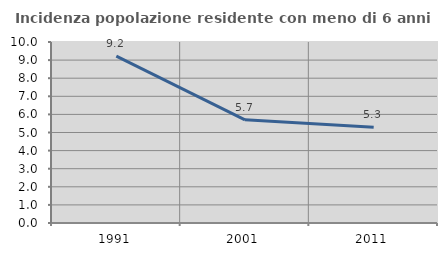
| Category | Incidenza popolazione residente con meno di 6 anni |
|---|---|
| 1991.0 | 9.222 |
| 2001.0 | 5.7 |
| 2011.0 | 5.288 |